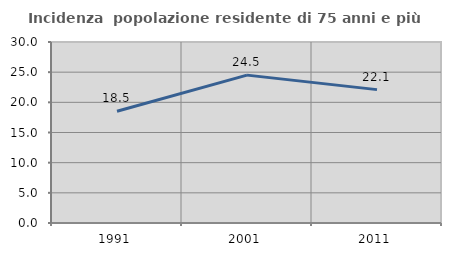
| Category | Incidenza  popolazione residente di 75 anni e più |
|---|---|
| 1991.0 | 18.519 |
| 2001.0 | 24.51 |
| 2011.0 | 22.105 |